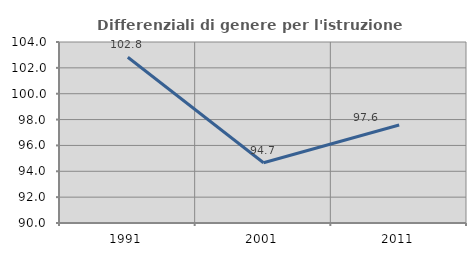
| Category | Differenziali di genere per l'istruzione superiore |
|---|---|
| 1991.0 | 102.824 |
| 2001.0 | 94.656 |
| 2011.0 | 97.582 |